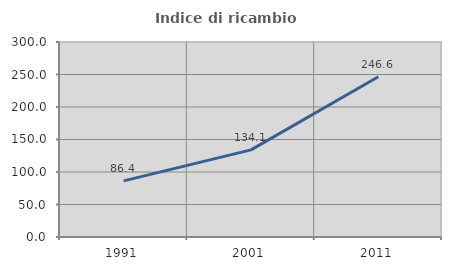
| Category | Indice di ricambio occupazionale  |
|---|---|
| 1991.0 | 86.391 |
| 2001.0 | 134.074 |
| 2011.0 | 246.602 |